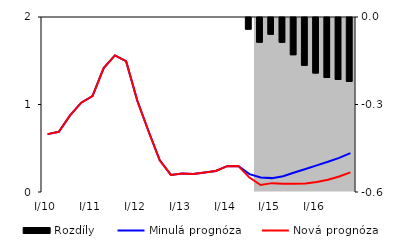
| Category | Rozdíly |
|---|---|
| 0 | 0 |
| 1 | 0 |
| 2 | 0 |
| 3 | 0 |
| 4 | 0 |
| 5 | 0 |
| 6 | 0 |
| 7 | 0 |
| 8 | 0 |
| 9 | 0 |
| 10 | 0 |
| 11 | 0 |
| 12 | 0 |
| 13 | 0 |
| 14 | 0 |
| 15 | 0 |
| 16 | 0 |
| 17 | 0 |
| 18 | -0.04 |
| 19 | -0.085 |
| 20 | -0.057 |
| 21 | -0.085 |
| 22 | -0.128 |
| 23 | -0.164 |
| 24 | -0.19 |
| 25 | -0.206 |
| 26 | -0.212 |
| 27 | -0.219 |